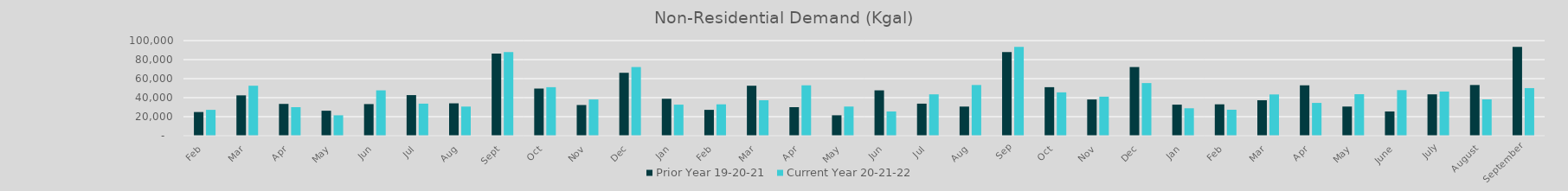
| Category | Prior Year 19-20-21 | Current Year 20-21-22 |
|---|---|---|
| Feb | 24891.705 | 27184.287 |
| Mar | 42416.796 | 52556.784 |
| Apr | 33427.881 | 30008.586 |
| May | 26254.448 | 21459.484 |
| Jun | 33248.873 | 47687.401 |
| Jul | 42679.938 | 33702.696 |
| Aug | 34036.498 | 30630.765 |
| Sep | 86367.775 | 87939.966 |
| Oct | 49561.754 | 51017.647 |
| Nov | 32261.42 | 38090.247 |
| Dec | 66164.871 | 72201.815 |
| Jan | 38851.995 | 32645.301 |
| Feb | 27184.287 | 32987.653 |
| Mar | 52556.784 | 37296.185 |
| Apr | 30008.586 | 52983.593 |
| May | 21459.484 | 30657.737 |
| Jun | 47687.401 | 25485.258 |
| Jul | 33702.696 | 43493.567 |
| Aug | 30630.765 | 53305.831 |
| Sep | 87939.966 | 93442.494 |
| Oct | 51017.647 | 45586.98 |
| Nov | 38090.247 | 41019.482 |
| Dec | 72201.815 | 55350.474 |
| Jan | 32645.301 | 28832.602 |
| Feb | 32987.653 | 27305.762 |
| Mar | 37296.185 | 43384.037 |
| Apr | 52983.593 | 34485.291 |
| May | 30657.737 | 43618.865 |
| June | 25485.258 | 47925.22 |
| July | 43493.567 | 46450.441 |
| August | 53305.831 | 38203.345 |
| September | 93442.494 | 50043.287 |